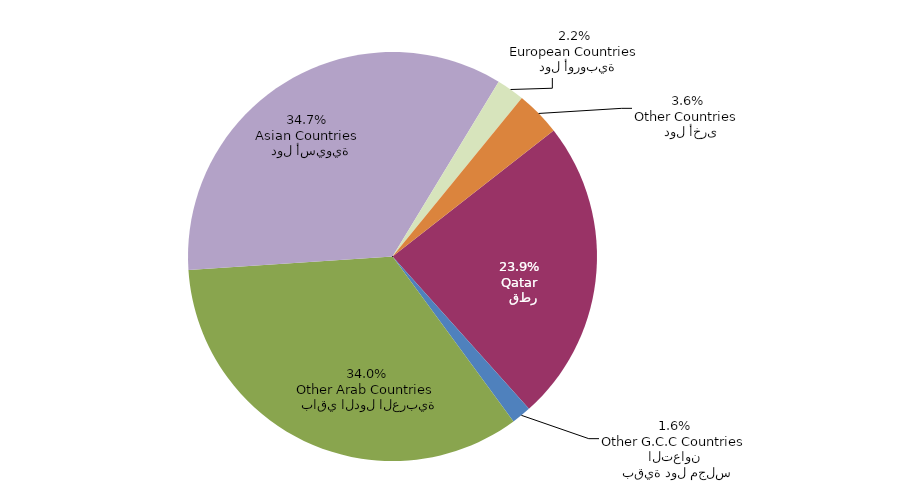
| Category | Series 0 |
|---|---|
|   قطر
Qatar | 1451 |
|   بقية دول مجلس التعاون
Other G.C.C Countries | 94 |
|   باقي الدول العربية
Other Arab Countries | 2063 |
|   دول أسيوية
Asian Countries | 2106 |
|   دول أوروبية
European Countries | 134 |
|   دول أخرى
Other Countries | 215 |